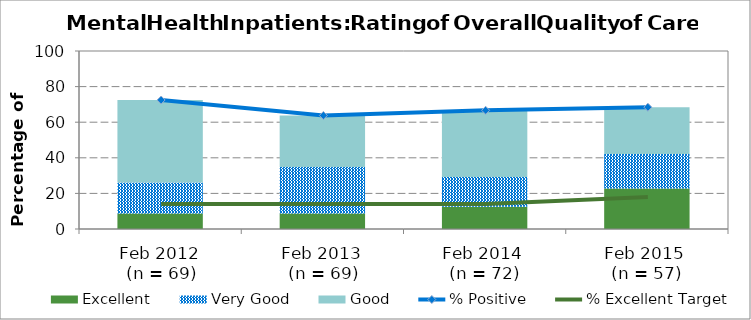
| Category | Excellent | Very Good | Good |
|---|---|---|---|
| Feb 2012
 (n = 69) | 8.7 | 17.39 | 46.38 |
| Feb 2013
 (n = 69) | 8.7 | 26.09 | 28.99 |
| Feb 2014 
(n = 72) | 12.5 | 16.67 | 37.5 |
| Feb 2015 
(n = 57) | 22.81 | 19.3 | 26.32 |